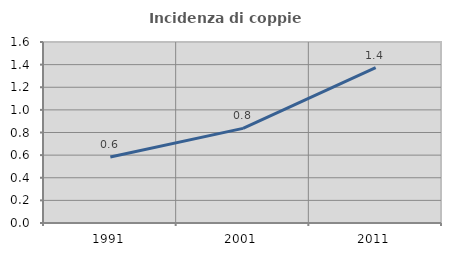
| Category | Incidenza di coppie miste |
|---|---|
| 1991.0 | 0.584 |
| 2001.0 | 0.836 |
| 2011.0 | 1.373 |